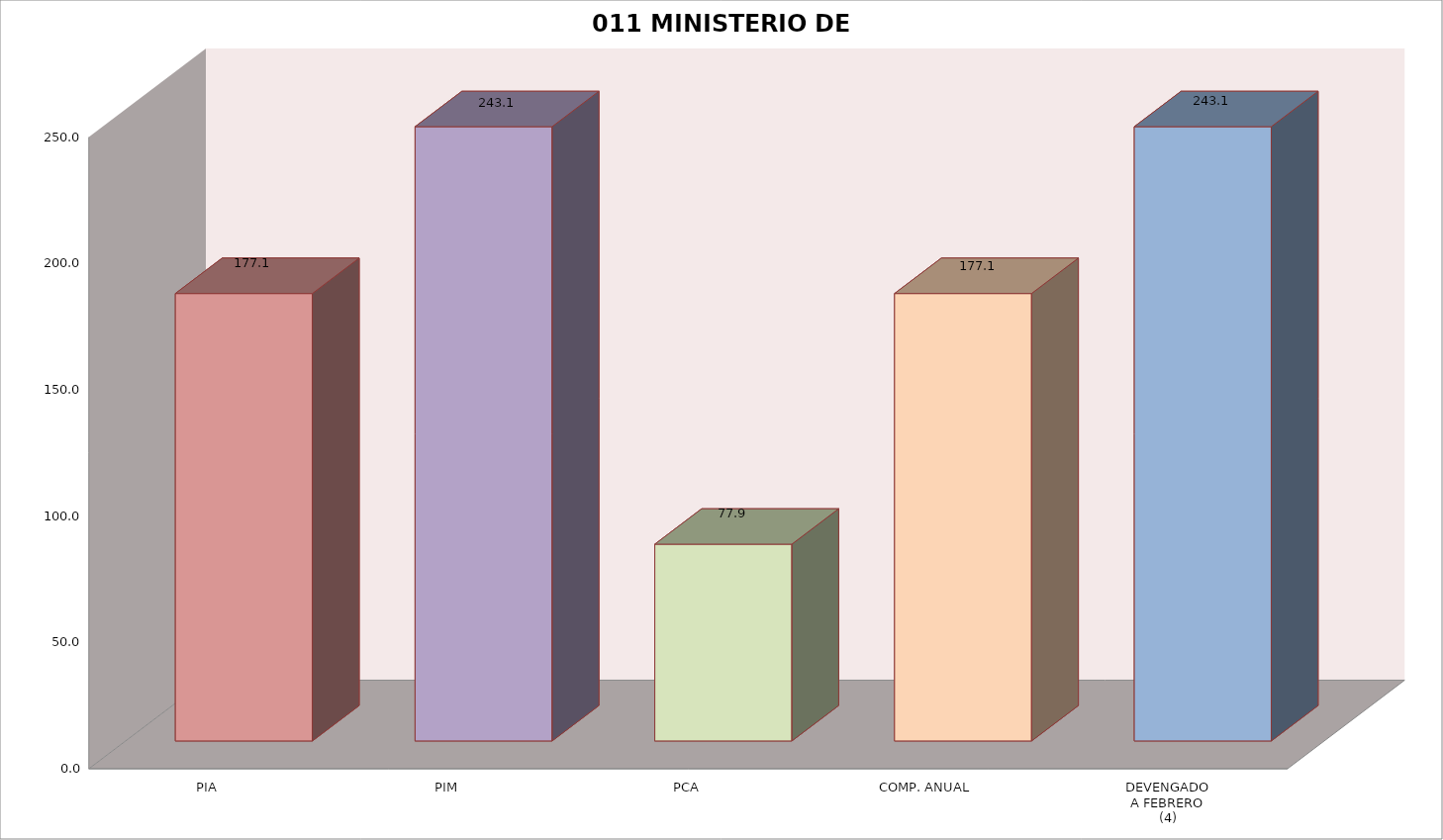
| Category | 011 MINISTERIO DE SALUD |
|---|---|
| PIA | 177.09 |
| PIM | 243.119 |
| PCA | 77.877 |
| COMP. ANUAL | 177.09 |
| DEVENGADO
A FEBRERO
(4) | 243.119 |